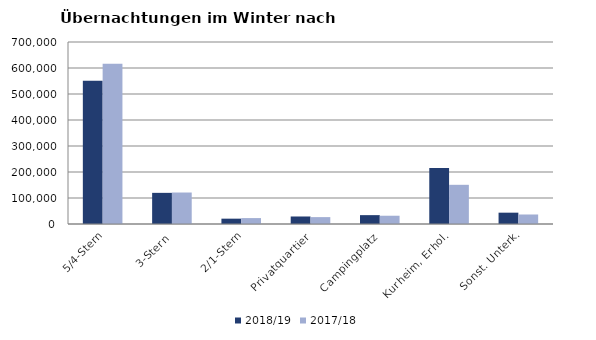
| Category | 2018/19 | 2017/18 |
|---|---|---|
| 5/4-Stern | 550841 | 616292 |
| 3-Stern | 119793 | 121082 |
| 2/1-Stern | 20521 | 22755 |
| Privatquartier | 28892 | 26492 |
| Campingplatz | 34073 | 31809 |
| Kurheim, Erhol. | 214912 | 150712 |
| Sonst. Unterk. | 43564 | 36565 |